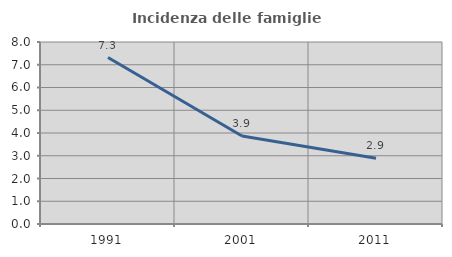
| Category | Incidenza delle famiglie numerose |
|---|---|
| 1991.0 | 7.317 |
| 2001.0 | 3.865 |
| 2011.0 | 2.893 |